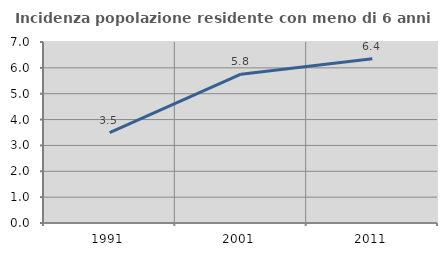
| Category | Incidenza popolazione residente con meno di 6 anni |
|---|---|
| 1991.0 | 3.491 |
| 2001.0 | 5.757 |
| 2011.0 | 6.352 |